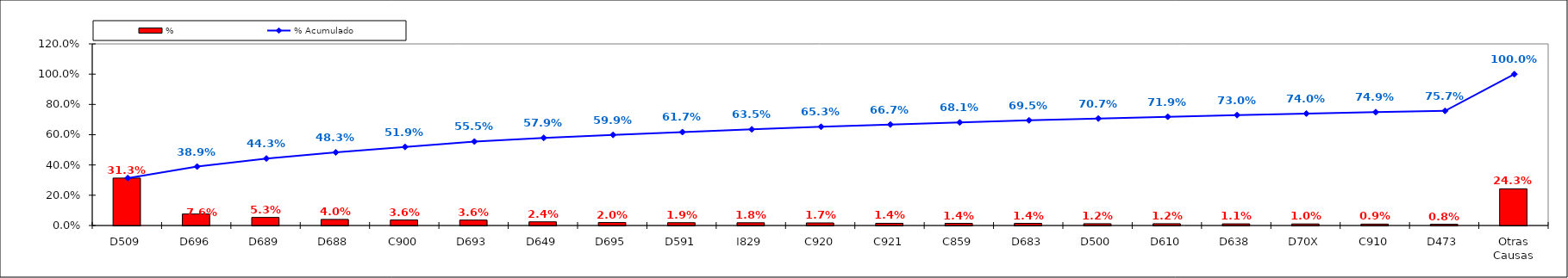
| Category | % |
|---|---|
| D509 | 0.313 |
| D696 | 0.076 |
| D689 | 0.053 |
| D688 | 0.04 |
| C900 | 0.036 |
| D693 | 0.036 |
| D649 | 0.024 |
| D695 | 0.02 |
| D591 | 0.019 |
| I829 | 0.018 |
| C920 | 0.017 |
| C921 | 0.014 |
| C859 | 0.014 |
| D683 | 0.014 |
| D500 | 0.012 |
| D610 | 0.012 |
| D638 | 0.011 |
| D70X | 0.01 |
| C910 | 0.009 |
| D473 | 0.008 |
| Otras Causas | 0.243 |